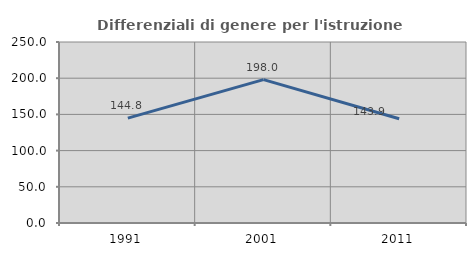
| Category | Differenziali di genere per l'istruzione superiore |
|---|---|
| 1991.0 | 144.841 |
| 2001.0 | 198 |
| 2011.0 | 143.91 |